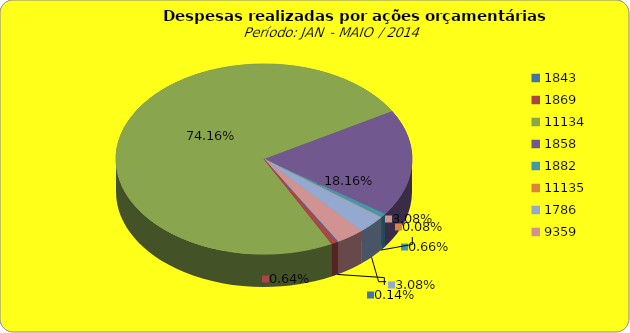
| Category | Series 1 |
|---|---|
| 1843.0 | 100000 |
| 1869.0 | 444374.37 |
| 11134.0 | 51490606 |
| 1858.0 | 12604897.34 |
| 1882.0 | 460659.2 |
| 11135.0 | 56231.57 |
| 1786.0 | 2136184.64 |
| 9359.0 | 2136184.64 |